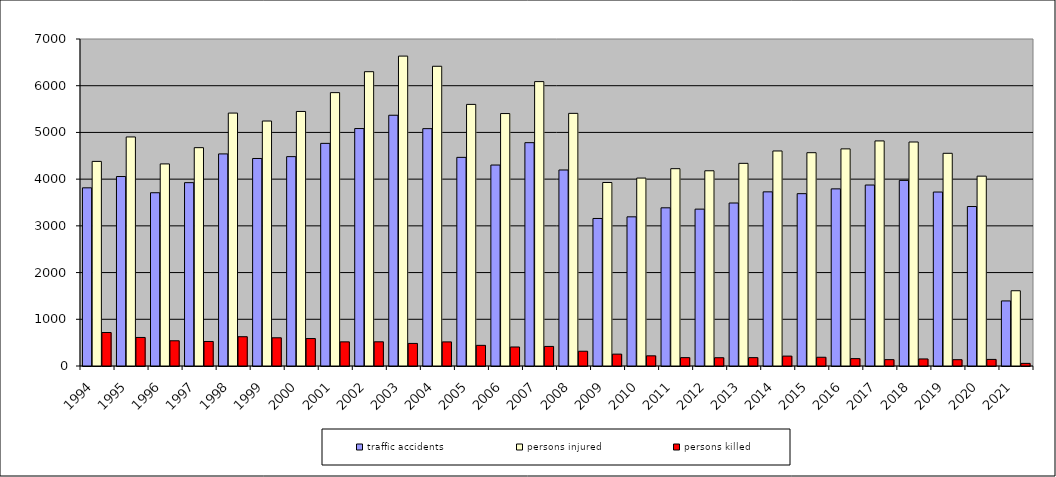
| Category | traffic accidents | persons injured | persons killed |
|---|---|---|---|
| 1994.0 | 3814 | 4380 | 717 |
| 1995.0 | 4056 | 4903 | 611 |
| 1996.0 | 3709 | 4326 | 540 |
| 1997.0 | 3925 | 4674 | 525 |
| 1998.0 | 4540 | 5414 | 627 |
| 1999.0 | 4442 | 5244 | 604 |
| 2000.0 | 4482 | 5449 | 588 |
| 2001.0 | 4766 | 5852 | 517 |
| 2002.0 | 5083 | 6300 | 518 |
| 2003.0 | 5368 | 6634 | 483 |
| 2004.0 | 5081 | 6416 | 516 |
| 2005.0 | 4466 | 5600 | 442 |
| 2006.0 | 4302 | 5404 | 407 |
| 2007.0 | 4781 | 6088 | 419 |
| 2008.0 | 4196 | 5408 | 316 |
| 2009.0 | 3158 | 3928 | 254 |
| 2010.0 | 3193 | 4023 | 218 |
| 2011.0 | 3386 | 4224 | 179 |
| 2012.0 | 3358 | 4179 | 177 |
| 2013.0 | 3489 | 4338 | 179 |
| 2014.0 | 3728 | 4603 | 212 |
| 2015.0 | 3689 | 4566 | 187 |
| 2016.0 | 3792 | 4648 | 158 |
| 2017.0 | 3874 | 4818 | 136 |
| 2018.0 | 3973 | 4795 | 151 |
| 2019.0 | 3724 | 4553 | 135 |
| 2020.0 | 3414 | 4064 | 141 |
| 2021.0 | 1393 | 1611 | 56 |